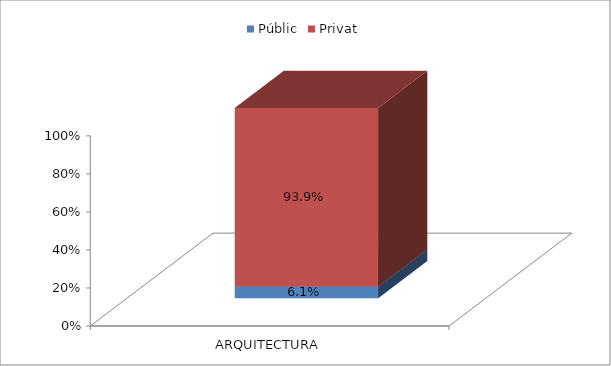
| Category | Públic | Privat |
|---|---|---|
| ARQUITECTURA | 0.061 | 0.939 |